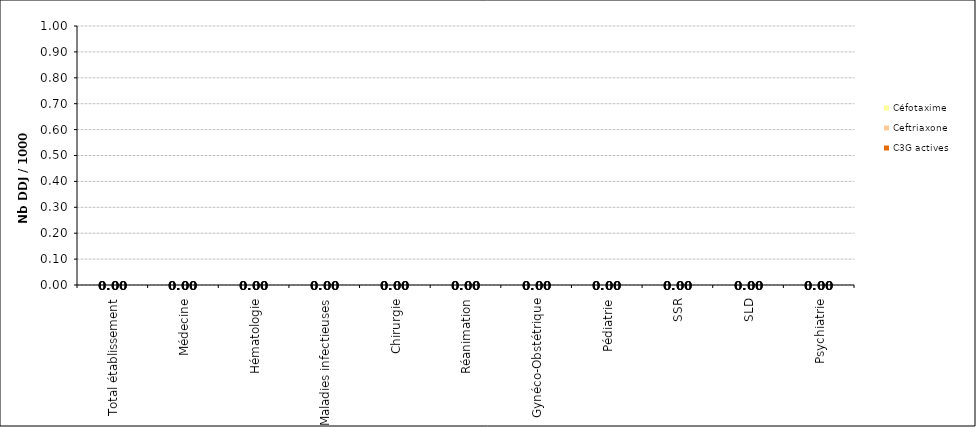
| Category | C3G actives | Ceftriaxone | Céfotaxime |
|---|---|---|---|
| Total établissement | 0 | 0 | 0 |
| Médecine | 0 | 0 | 0 |
| Hématologie | 0 | 0 | 0 |
| Maladies infectieuses | 0 | 0 | 0 |
| Chirurgie | 0 | 0 | 0 |
| Réanimation | 0 | 0 | 0 |
| Gynéco-Obstétrique | 0 | 0 | 0 |
| Pédiatrie | 0 | 0 | 0 |
| SSR | 0 | 0 | 0 |
| SLD | 0 | 0 | 0 |
| Psychiatrie | 0 | 0 | 0 |